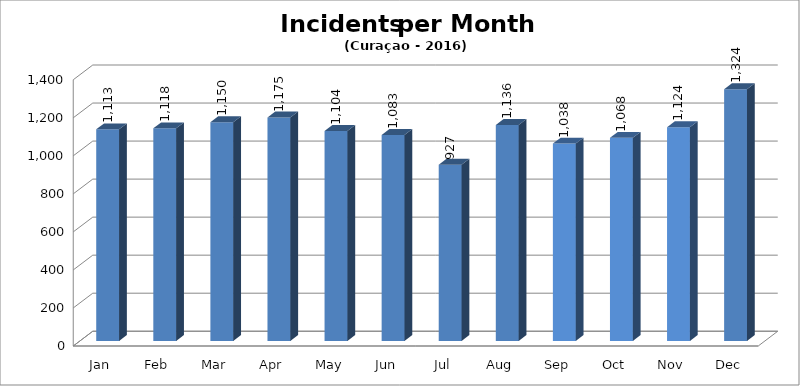
| Category | 2016 |
|---|---|
| Jan | 1113 |
| Feb | 1118 |
| Mar | 1150 |
| Apr | 1175 |
| May | 1104 |
| Jun | 1083 |
| Jul | 927 |
| Aug | 1136 |
| Sep | 1038 |
| Oct | 1068 |
| Nov | 1124 |
| Dec | 1324 |